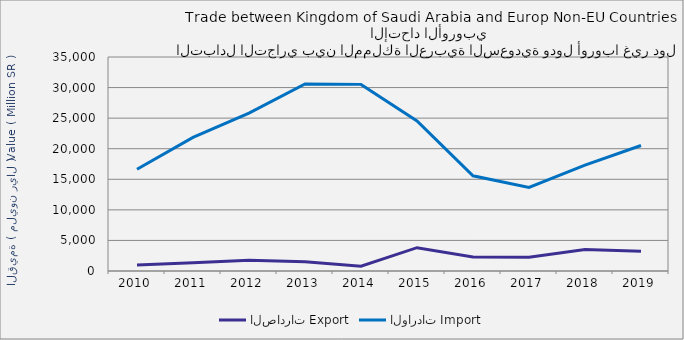
| Category | الصادرات | الواردات |
|---|---|---|
| 2010.0 | 977655073 | 16651954528 |
| 2011.0 | 1338033602 | 21845952326 |
| 2012.0 | 1768623879 | 25834920782 |
| 2013.0 | 1523350473 | 30583895729 |
| 2014.0 | 794931092 | 30522887482 |
| 2015.0 | 3812224092 | 24543035222 |
| 2016.0 | 2293178465 | 15576335883 |
| 2017.0 | 2236280551 | 13676715930 |
| 2018.0 | 3515093487 | 17326337006 |
| 2019.0 | 3219781999 | 20520427090 |